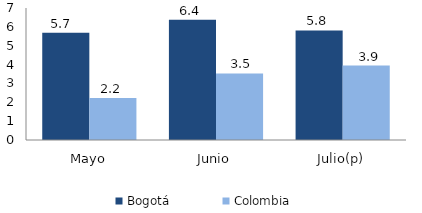
| Category | Bogotá | Colombia |
|---|---|---|
| Mayo | 5.691 | 2.221 |
| Junio | 6.372 | 3.527 |
| Julio(p) | 5.809 | 3.946 |